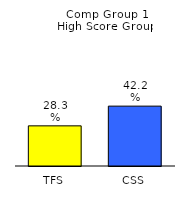
| Category | Series 0 |
|---|---|
| TFS | 0.283 |
| CSS | 0.422 |